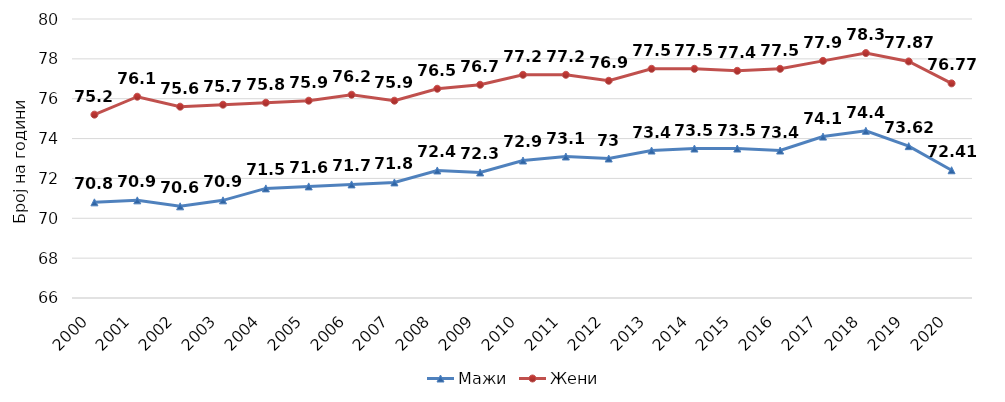
| Category | Мажи | Жени |
|---|---|---|
| 2000 | 70.8 | 75.2 |
| 2001 | 70.9 | 76.1 |
| 2002 | 70.6 | 75.6 |
| 2003 | 70.9 | 75.7 |
| 2004 | 71.5 | 75.8 |
| 2005 | 71.6 | 75.9 |
| 2006 | 71.7 | 76.2 |
| 2007 | 71.8 | 75.9 |
| 2008 | 72.4 | 76.5 |
| 2009 | 72.3 | 76.7 |
| 2010 | 72.9 | 77.2 |
| 2011 | 73.1 | 77.2 |
| 2012 | 73 | 76.9 |
| 2013 | 73.4 | 77.5 |
| 2014 | 73.5 | 77.5 |
| 2015 | 73.5 | 77.4 |
| 2016 | 73.4 | 77.5 |
| 2017 | 74.1 | 77.9 |
| 2018 | 74.39 | 78.29 |
| 2019 | 73.62 | 77.87 |
| 2020 | 72.41 | 76.77 |